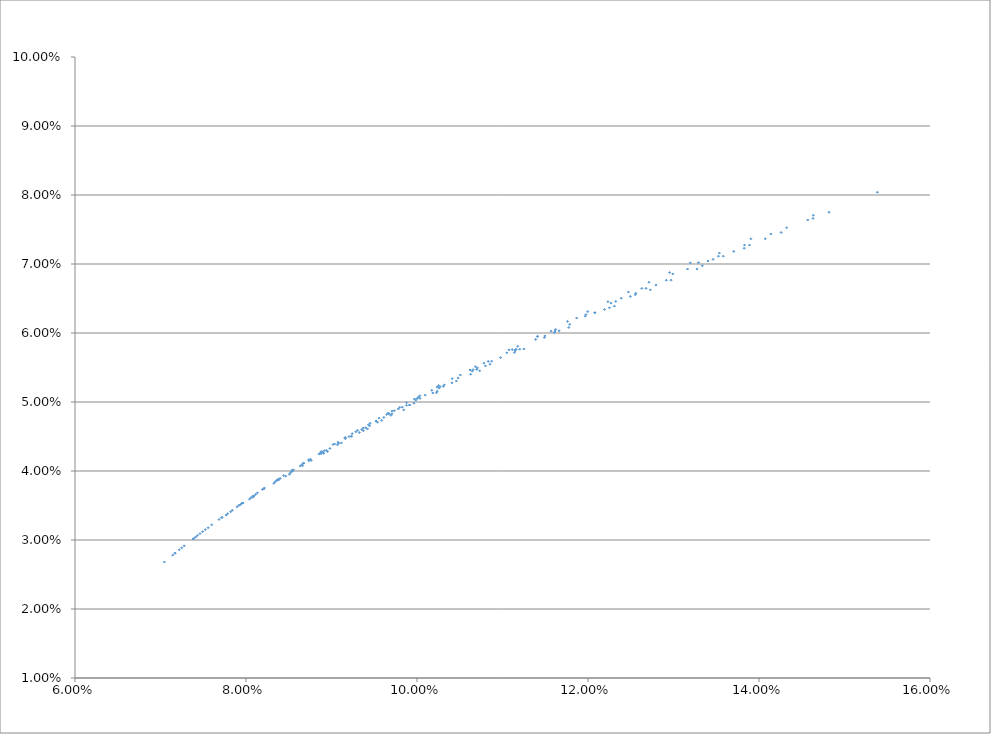
| Category | Series 0 |
|---|---|
| 0.07045335655674033 | 0.027 |
| 0.07389877580001789 | 0.03 |
| 0.07767706948538954 | 0.034 |
| 0.08079924843482389 | 0.036 |
| 0.08506082377108816 | 0.04 |
| 0.0895405683367402 | 0.043 |
| 0.09420736414943037 | 0.046 |
| 0.09844293276271103 | 0.049 |
| 0.1022800888367124 | 0.051 |
| 0.1073347003627056 | 0.055 |
| 0.11249712741187863 | 0.058 |
| 0.11775319059101404 | 0.061 |
| 0.12309089550925183 | 0.064 |
| 0.12728946237910332 | 0.066 |
| 0.13274896997549182 | 0.069 |
| 0.1382653798707886 | 0.072 |
| 0.14259039827924558 | 0.075 |
| 0.1481930330905616 | 0.077 |
| 0.1538365134686603 | 0.08 |
| 0.07598941284647875 | 0.032 |
| 0.07894856239408911 | 0.035 |
| 0.0820808290633209 | 0.037 |
| 0.0853671590931713 | 0.04 |
| 0.08879044745829089 | 0.043 |
| 0.09233546244177346 | 0.045 |
| 0.0953893918362492 | 0.047 |
| 0.09913332373988247 | 0.05 |
| 0.1040864340490599 | 0.053 |
| 0.10801365931947923 | 0.055 |
| 0.11200811489534006 | 0.058 |
| 0.1160628595267188 | 0.06 |
| 0.12079534949292656 | 0.063 |
| 0.12495483066711383 | 0.065 |
| 0.12915806328396168 | 0.068 |
| 0.1340323834919886 | 0.07 |
| 0.13831196303132237 | 0.073 |
| 0.14138465029643363 | 0.074 |
| 0.14635475250482802 | 0.077 |
| 0.08214842931893844 | 0.038 |
| 0.0844024595569288 | 0.039 |
| 0.08673528135013067 | 0.041 |
| 0.0891407089631363 | 0.043 |
| 0.09161302347347666 | 0.045 |
| 0.09520912454330163 | 0.047 |
| 0.09781872319191048 | 0.049 |
| 0.10096362731534475 | 0.051 |
| 0.10480788675720823 | 0.053 |
| 0.10872734048361378 | 0.056 |
| 0.11155480867680262 | 0.058 |
| 0.11621779546588805 | 0.061 |
| 0.11975728118185809 | 0.063 |
| 0.1226901082272577 | 0.064 |
| 0.12628864794911676 | 0.066 |
| 0.12991503123980652 | 0.069 |
| 0.1329209847316597 | 0.07 |
| 0.1353668654983794 | 0.072 |
| 0.1390543026247056 | 0.074 |
| 0.0888008793569031 | 0.043 |
| 0.09018718362515929 | 0.044 |
| 0.09160222004586277 | 0.045 |
| 0.0930446777405169 | 0.046 |
| 0.09557149584960857 | 0.048 |
| 0.09707722219743199 | 0.049 |
| 0.09969469968518865 | 0.05 |
| 0.10236162529486964 | 0.052 |
| 0.10620045664064552 | 0.055 |
| 0.10833195499231826 | 0.056 |
| 0.11177561786086525 | 0.058 |
| 0.11409431789048145 | 0.06 |
| 0.11760404320992472 | 0.062 |
| 0.11996353539795293 | 0.063 |
| 0.12233770620166629 | 0.065 |
| 0.12472571739561072 | 0.066 |
| 0.12712678902839286 | 0.067 |
| 0.12954019486300175 | 0.069 |
| 0.13196525819045946 | 0.07 |
| 0.0727767918053893 | 0.029 |
| 0.07557994753792717 | 0.032 |
| 0.07821053792060967 | 0.034 |
| 0.08041071837441316 | 0.036 |
| 0.08325366617972188 | 0.038 |
| 0.08463812024254314 | 0.039 |
| 0.0866212811897481 | 0.041 |
| 0.08908806660467945 | 0.043 |
| 0.09115614119857465 | 0.044 |
| 0.09372886571913165 | 0.046 |
| 0.09695073680631006 | 0.048 |
| 0.09963193967628917 | 0.05 |
| 0.10235929147844851 | 0.052 |
| 0.10626330546868511 | 0.054 |
| 0.11139372071414219 | 0.057 |
| 0.11662150909851966 | 0.06 |
| 0.12251030895665545 | 0.064 |
| 0.12971356721036012 | 0.068 |
| 0.140735797069096 | 0.074 |
| 0.07492786585141713 | 0.031 |
| 0.07839816589101176 | 0.034 |
| 0.08058297670694387 | 0.036 |
| 0.08342022116503062 | 0.038 |
| 0.08635614199764617 | 0.041 |
| 0.08938101599018046 | 0.043 |
| 0.09084518955993073 | 0.044 |
| 0.09398998079602779 | 0.046 |
| 0.09612510398180066 | 0.048 |
| 0.09876543628772703 | 0.05 |
| 0.10256651414901555 | 0.052 |
| 0.10644750161719756 | 0.054 |
| 0.10977771031883858 | 0.056 |
| 0.11496029218768307 | 0.06 |
| 0.12079534949292656 | 0.063 |
| 0.1279464350332921 | 0.067 |
| 0.13582172181251684 | 0.071 |
| 0.14632176452084047 | 0.077 |
| 0.07248292564889276 | 0.029 |
| 0.07717368906697954 | 0.033 |
| 0.08077560530033254 | 0.036 |
| 0.08360647963705498 | 0.039 |
| 0.0865362424663313 | 0.041 |
| 0.08853952178747232 | 0.042 |
| 0.09161302347347666 | 0.045 |
| 0.09370424722099012 | 0.046 |
| 0.09520912454330163 | 0.047 |
| 0.09735542070099357 | 0.049 |
| 0.10000100485944308 | 0.05 |
| 0.10269443567139454 | 0.052 |
| 0.10656305885756226 | 0.055 |
| 0.11050396492697584 | 0.057 |
| 0.1138778416422919 | 0.059 |
| 0.1196750155143039 | 0.062 |
| 0.12678923386541224 | 0.066 |
| 0.13462496091123 | 0.071 |
| 0.1457025746215901 | 0.076 |
| 0.0737953989581967 | 0.03 |
| 0.0795062326799707 | 0.035 |
| 0.0838123102330471 | 0.039 |
| 0.08673528135013067 | 0.041 |
| 0.0903603423642896 | 0.044 |
| 0.09242031673363953 | 0.045 |
| 0.09451330121076153 | 0.047 |
| 0.09663715100323066 | 0.048 |
| 0.09878987544248409 | 0.05 |
| 0.10032979721146526 | 0.051 |
| 0.10253062669602135 | 0.052 |
| 0.1041119580992224 | 0.053 |
| 0.10684083794044309 | 0.055 |
| 0.1107570342778284 | 0.058 |
| 0.11409431789048145 | 0.06 |
| 0.11867077305832643 | 0.062 |
| 0.12388637757868694 | 0.065 |
| 0.13163954615036694 | 0.069 |
| 0.0717007705512443 | 0.028 |
| 0.07409700940203864 | 0.03 |
| 0.0752487886818322 | 0.031 |
| 0.0778551974366858 | 0.034 |
| 0.0796609895579755 | 0.035 |
| 0.08096036568007002 | 0.036 |
| 0.08381769608796487 | 0.039 |
| 0.0852043010094981 | 0.04 |
| 0.08762754113978803 | 0.042 |
| 0.09070112089408554 | 0.044 |
| 0.09325731195313518 | 0.046 |
| 0.09586961064874591 | 0.047 |
| 0.09913332373988247 | 0.05 |
| 0.10184739434333556 | 0.051 |
| 0.1046049267734287 | 0.053 |
| 0.10854684200242923 | 0.055 |
| 0.11488933215013272 | 0.059 |
| 0.12193414697597435 | 0.063 |
| 0.0714276053419742 | 0.028 |
| 0.07461731111967643 | 0.031 |
| 0.07717368906697954 | 0.033 |
| 0.07930004920153438 | 0.035 |
| 0.081141807015185 | 0.037 |
| 0.08399313110920865 | 0.039 |
| 0.0853671590931713 | 0.04 |
| 0.08735500038183422 | 0.041 |
| 0.08981344722286715 | 0.043 |
| 0.09233546244177346 | 0.045 |
| 0.09444947430736313 | 0.047 |
| 0.0970685657336752 | 0.048 |
| 0.10034845395173671 | 0.051 |
| 0.1030671398300748 | 0.052 |
| 0.10696390720942268 | 0.055 |
| 0.11146678111042263 | 0.057 |
| 0.11786340001683904 | 0.061 |
| 0.12553208496794377 | 0.066 |
| 0.1388892155040384 | 0.073 |
| 0.0722000051972197 | 0.029 |
| 0.0768477798926824 | 0.033 |
| 0.0795062326799707 | 0.035 |
| 0.08134343643803724 | 0.037 |
| 0.08360647963705498 | 0.039 |
| 0.08554928733765743 | 0.04 |
| 0.08753309875879006 | 0.042 |
| 0.08895633699482429 | 0.043 |
| 0.09204584317234119 | 0.045 |
| 0.09353760173243597 | 0.046 |
| 0.09673766358955005 | 0.048 |
| 0.09828876043903235 | 0.049 |
| 0.09986136395989968 | 0.05 |
| 0.10318634775925443 | 0.052 |
| 0.1070711077555404 | 0.055 |
| 0.11155480867680262 | 0.058 |
| 0.11613314249870542 | 0.06 |
| 0.1255840288704682 | 0.066 |
| 0.13705097774694694 | 0.072 |
| 0.07431725446443033 | 0.031 |
| 0.07916621108612969 | 0.035 |
| 0.08191808917029472 | 0.037 |
| 0.08537041450816901 | 0.04 |
| 0.08733737417115994 | 0.042 |
| 0.08873417190300774 | 0.043 |
| 0.09077016681373881 | 0.044 |
| 0.09284082502396576 | 0.046 |
| 0.09432142808483505 | 0.047 |
| 0.0964494067890736 | 0.048 |
| 0.09797827700474947 | 0.049 |
| 0.10015717500551695 | 0.051 |
| 0.1017293275804185 | 0.052 |
| 0.10507423391408353 | 0.054 |
| 0.1078290779158977 | 0.056 |
| 0.11113764567173226 | 0.058 |
| 0.11567921420402306 | 0.06 |
| 0.12324952205707489 | 0.065 |
| 0.13525753955934552 | 0.071 |
| 0.0717007705512443 | 0.028 |
| 0.1432317833320817 | 0.075 |
| 0.13337062499404903 | 0.07 |